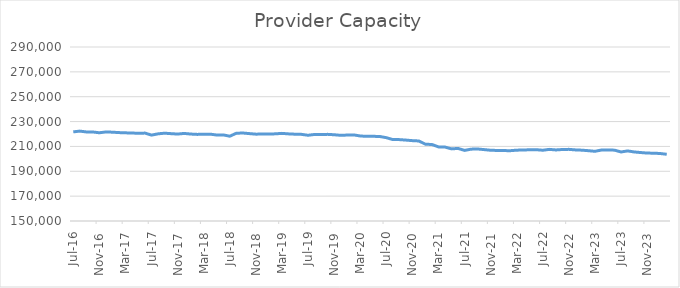
| Category | Series 0 |
|---|---|
| 2016-07-01 | 221708 |
| 2016-08-01 | 222321 |
| 2016-09-01 | 221667 |
| 2016-10-01 | 221621 |
| 2016-11-01 | 220994 |
| 2016-12-01 | 221640 |
| 2017-01-01 | 221469 |
| 2017-02-01 | 221134 |
| 2017-03-01 | 220927 |
| 2017-04-01 | 220808 |
| 2017-05-01 | 220534 |
| 2017-06-01 | 220730 |
| 2017-07-01 | 219107 |
| 2017-08-01 | 220134 |
| 2017-09-01 | 220645 |
| 2017-10-01 | 220272 |
| 2017-11-01 | 219949 |
| 2017-12-01 | 220465 |
| 2018-01-01 | 219959 |
| 2018-02-01 | 219682 |
| 2018-03-01 | 219818 |
| 2018-04-01 | 219873 |
| 2018-05-01 | 219182 |
| 2018-06-01 | 219270 |
| 2018-07-01 | 218220 |
| 2018-08-01 | 220593 |
| 2018-09-01 | 220799 |
| 2018-10-01 | 220319 |
| 2018-11-01 | 219880 |
| 2018-12-01 | 219959 |
| 2019-01-01 | 219952 |
| 2019-02-01 | 220129 |
| 2019-03-01 | 220507 |
| 2019-04-01 | 220096 |
| 2019-05-01 | 219845 |
| 2019-06-01 | 219709 |
| 2019-07-01 | 218980 |
| 2019-08-01 | 219627 |
| 2019-09-01 | 219502 |
| 2019-10-01 | 219716 |
| 2019-11-01 | 219398 |
| 2019-12-01 | 218938 |
| 2020-01-01 | 219149 |
| 2020-02-01 | 219270 |
| 2020-03-01 | 218404 |
| 2020-04-01 | 218101 |
| 2020-05-01 | 218133 |
| 2020-06-01 | 217989 |
| 2020-07-01 | 217052 |
| 2020-08-01 | 215503 |
| 2020-09-01 | 215485 |
| 2020-10-01 | 215106 |
| 2020-11-01 | 214656 |
| 2020-12-01 | 214391 |
| 2021-01-01 | 211774 |
| 2021-02-01 | 211557 |
| 2021-03-01 | 209635 |
| 2021-04-01 | 209487 |
| 2021-05-01 | 208029 |
| 2021-06-01 | 208411 |
| 2021-07-01 | 206803 |
| 2021-08-01 | 207807 |
| 2021-09-01 | 207947 |
| 2021-10-01 | 207449 |
| 2021-11-01 | 206918 |
| 2021-12-01 | 206769 |
| 2022-01-01 | 206664 |
| 2022-02-01 | 206567 |
| 2022-03-01 | 206994 |
| 2022-04-01 | 207118 |
| 2022-05-01 | 207320 |
| 2022-06-01 | 207360 |
| 2022-07-01 | 206937 |
| 2022-08-01 | 207630 |
| 2022-09-01 | 207172 |
| 2022-10-01 | 207528 |
| 2022-11-01 | 207645 |
| 2022-12-01 | 207200 |
| 2023-01-01 | 206983 |
| 2023-02-01 | 206566 |
| 2023-03-01 | 206069 |
| 2023-04-01 | 207108 |
| 2023-05-01 | 207137 |
| 2023-06-01 | 207004 |
| 2023-07-01 | 205536 |
| 2023-08-01 | 206395 |
| 2023-09-01 | 205563 |
| 2023-10-01 | 205091 |
| 2023-11-01 | 204643 |
| 2023-12-01 | 204577 |
| 2024-01-01 | 204299 |
| 2024-02-01 | 203666 |